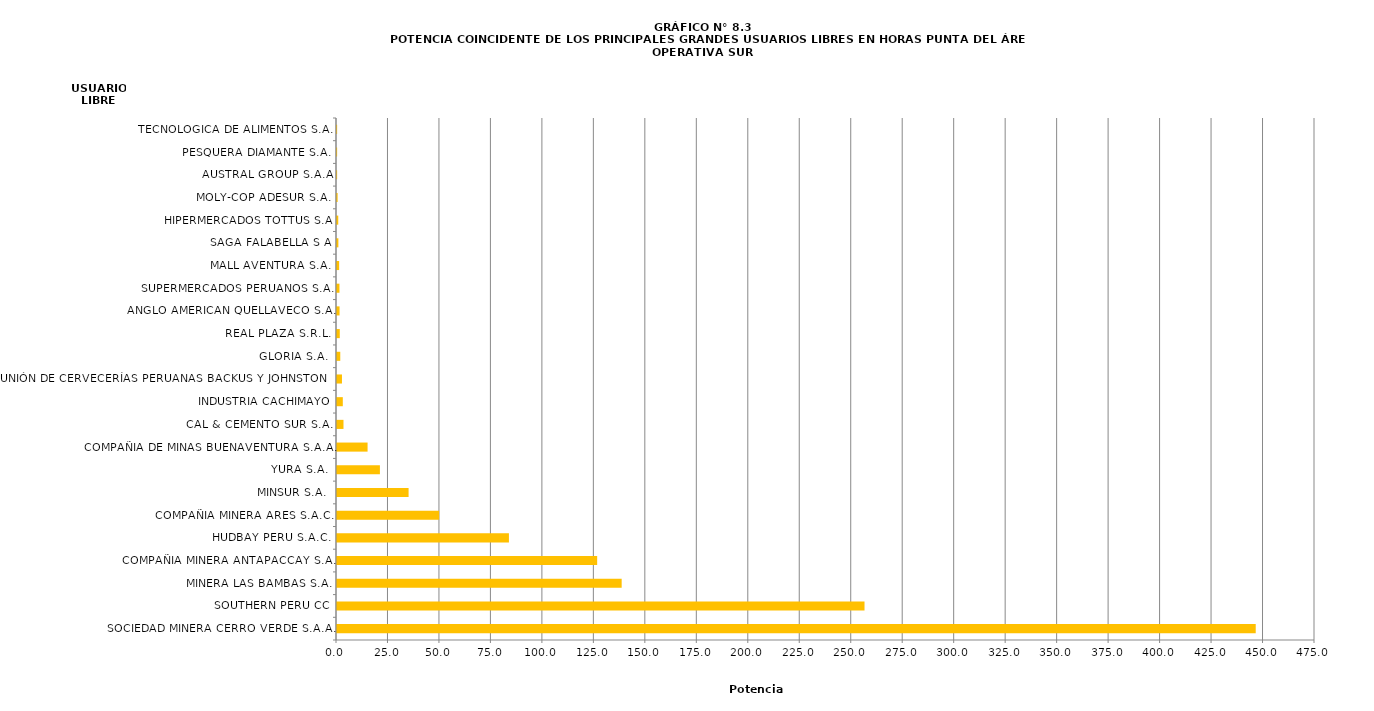
| Category | Series 0 |
|---|---|
| SOCIEDAD MINERA CERRO VERDE S.A.A. | 446.21 |
| SOUTHERN PERU CC | 256.21 |
| MINERA LAS BAMBAS S.A. | 138.26 |
| COMPAÑIA MINERA ANTAPACCAY S.A. | 126.36 |
| HUDBAY PERU S.A.C. | 83.5 |
| COMPAÑIA MINERA ARES S.A.C. | 49.62 |
| MINSUR S.A. | 34.77 |
| YURA S.A. | 20.84 |
| COMPAÑIA DE MINAS BUENAVENTURA S.A.A. | 14.85 |
| CAL & CEMENTO SUR S.A. | 3.15 |
| INDUSTRIA CACHIMAYO | 2.82 |
| UNIÓN DE CERVECERÍAS PERUANAS BACKUS Y JOHNSTON S. | 2.41 |
| GLORIA S.A. | 1.59 |
| REAL PLAZA S.R.L. | 1.35 |
| ANGLO AMERICAN QUELLAVECO S.A. | 1.24 |
| SUPERMERCADOS PERUANOS S.A. | 1.19 |
| MALL AVENTURA S.A. | 1.05 |
| SAGA FALABELLA S A | 0.67 |
| HIPERMERCADOS TOTTUS S.A | 0.61 |
| MOLY-COP ADESUR S.A. | 0.3 |
| AUSTRAL GROUP S.A.A | 0.06 |
| PESQUERA DIAMANTE S.A. | 0.06 |
| TECNOLOGICA DE ALIMENTOS S.A. | 0.06 |